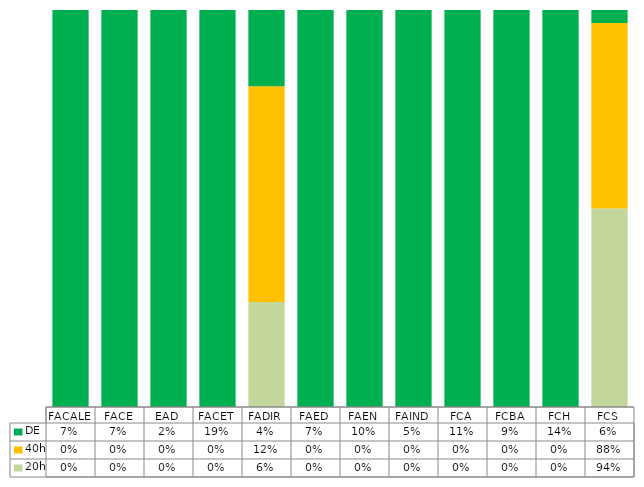
| Category | 20h | 40h | DE |
|---|---|---|---|
| FACALE | 0 | 0 | 0.067 |
| FACE | 0 | 0 | 0.069 |
| EAD | 0 | 0 | 0.02 |
| FACET | 0 | 0 | 0.188 |
| FADIR | 0.057 | 0.118 | 0.042 |
| FAED | 0 | 0 | 0.072 |
| FAEN | 0 | 0 | 0.103 |
| FAIND | 0 | 0 | 0.047 |
| FCA | 0 | 0 | 0.11 |
| FCBA | 0 | 0 | 0.087 |
| FCH | 0 | 0 | 0.135 |
| FCS | 0.943 | 0.882 | 0.061 |